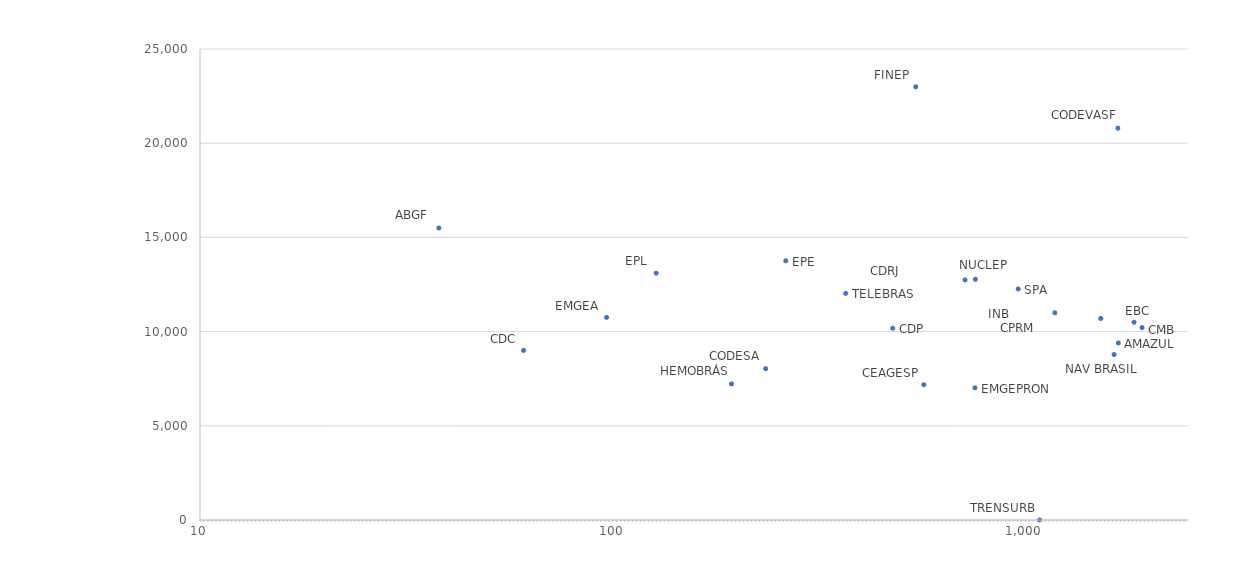
| Category | Qtd. Empregados x Salário Médio (Base 2020) |
|---|---|
| 1934.0 | 10214 |
| 1849.0 | 10496 |
| 1694.0 | 9395 |
| 1535.0 | 10698 |
| 1689.0 | 20797.48 |
| 1188.0 | 10999 |
| 1091.0 | 0 |
| 968.0 | 12264 |
| 760.0 | 7015 |
| 762.0 | 12775 |
| 719.0 | 12744 |
| 571.0 | 7181 |
| 546.0 | 22995 |
| 480.0 | 10180 |
| 369.0 | 12027 |
| 264.0 | 13759 |
| 236.0 | 8032 |
| 195.0 | 7224 |
| 1654.0 | 8786 |
| 128.0 | 13102 |
| 97.0 | 10754 |
| 61.0 | 9000 |
| 58.0 | 34124 |
| 38.0 | 15500 |